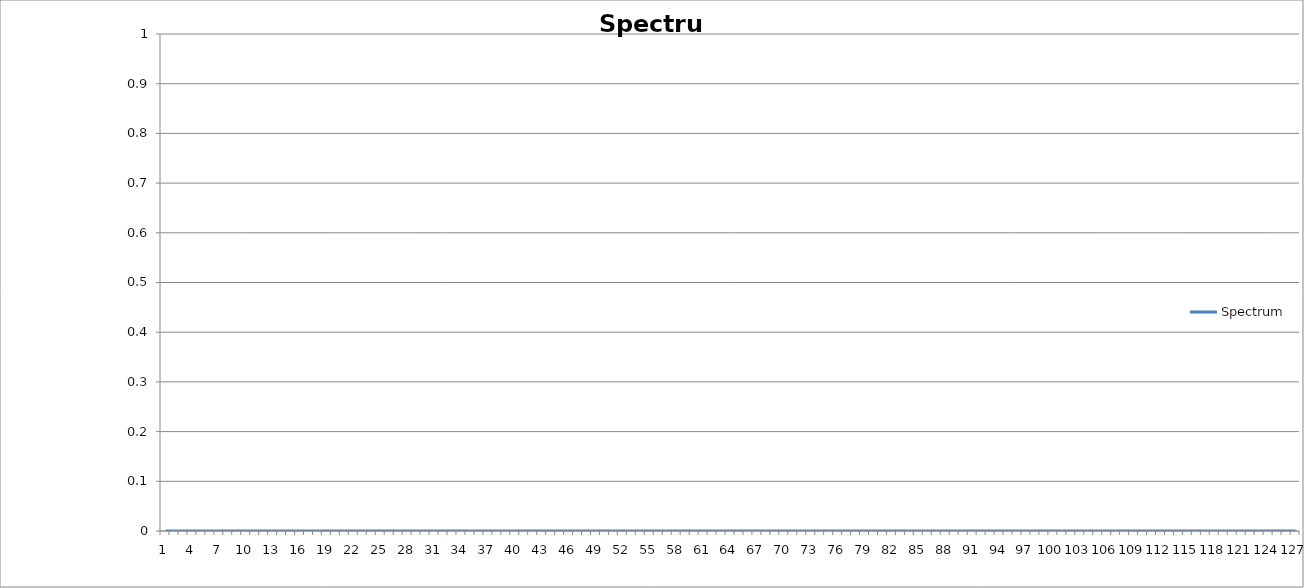
| Category | Spectrum |
|---|---|
| 0 | 0 |
| 1 | 0 |
| 2 | 0 |
| 3 | 0 |
| 4 | 0 |
| 5 | 0 |
| 6 | 0 |
| 7 | 0 |
| 8 | 0 |
| 9 | 0 |
| 10 | 0 |
| 11 | 0 |
| 12 | 0 |
| 13 | 0 |
| 14 | 0 |
| 15 | 0 |
| 16 | 0 |
| 17 | 0 |
| 18 | 0 |
| 19 | 0 |
| 20 | 0 |
| 21 | 0 |
| 22 | 0 |
| 23 | 0 |
| 24 | 0 |
| 25 | 0 |
| 26 | 0 |
| 27 | 0 |
| 28 | 0 |
| 29 | 0 |
| 30 | 0 |
| 31 | 0 |
| 32 | 0 |
| 33 | 0 |
| 34 | 0 |
| 35 | 0 |
| 36 | 0 |
| 37 | 0 |
| 38 | 0 |
| 39 | 0 |
| 40 | 0 |
| 41 | 0 |
| 42 | 0 |
| 43 | 0 |
| 44 | 0 |
| 45 | 0 |
| 46 | 0 |
| 47 | 0 |
| 48 | 0 |
| 49 | 0 |
| 50 | 0 |
| 51 | 0 |
| 52 | 0 |
| 53 | 0 |
| 54 | 0 |
| 55 | 0 |
| 56 | 0 |
| 57 | 0 |
| 58 | 0 |
| 59 | 0 |
| 60 | 0 |
| 61 | 0 |
| 62 | 0 |
| 63 | 0 |
| 64 | 0 |
| 65 | 0 |
| 66 | 0 |
| 67 | 0 |
| 68 | 0 |
| 69 | 0 |
| 70 | 0 |
| 71 | 0 |
| 72 | 0 |
| 73 | 0 |
| 74 | 0 |
| 75 | 0 |
| 76 | 0 |
| 77 | 0 |
| 78 | 0 |
| 79 | 0 |
| 80 | 0 |
| 81 | 0 |
| 82 | 0 |
| 83 | 0 |
| 84 | 0 |
| 85 | 0 |
| 86 | 0 |
| 87 | 0 |
| 88 | 0 |
| 89 | 0 |
| 90 | 0 |
| 91 | 0 |
| 92 | 0 |
| 93 | 0 |
| 94 | 0 |
| 95 | 0 |
| 96 | 0 |
| 97 | 0 |
| 98 | 0 |
| 99 | 0 |
| 100 | 0 |
| 101 | 0 |
| 102 | 0 |
| 103 | 0 |
| 104 | 0 |
| 105 | 0 |
| 106 | 0 |
| 107 | 0 |
| 108 | 0 |
| 109 | 0 |
| 110 | 0 |
| 111 | 0 |
| 112 | 0 |
| 113 | 0 |
| 114 | 0 |
| 115 | 0 |
| 116 | 0 |
| 117 | 0 |
| 118 | 0 |
| 119 | 0 |
| 120 | 0 |
| 121 | 0 |
| 122 | 0 |
| 123 | 0 |
| 124 | 0 |
| 125 | 0 |
| 126 | 0 |